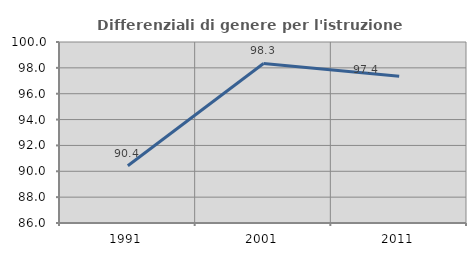
| Category | Differenziali di genere per l'istruzione superiore |
|---|---|
| 1991.0 | 90.424 |
| 2001.0 | 98.34 |
| 2011.0 | 97.358 |